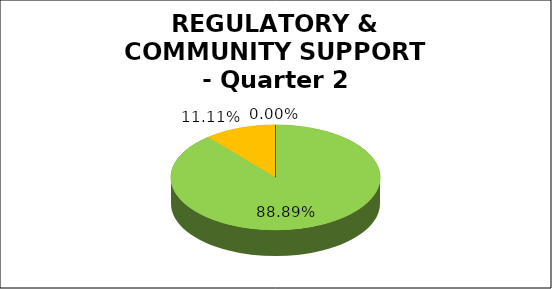
| Category | Q2 |
|---|---|
| Green | 0.889 |
| Amber | 0.111 |
| Red | 0 |